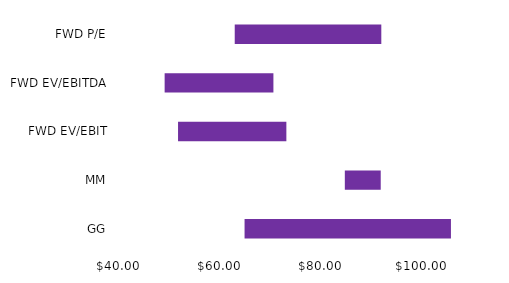
| Category | Q1 | Diff | Q3 |
|---|---|---|---|
| GG | 64.899 | 40.925 | 105.824 |
| MM | 84.781 | 7.12 | 91.901 |
| FWD EV/EBIT | 51.708 | 21.482 | 73.19 |
| FWD EV/EBITDA | 49.05 | 21.57 | 70.62 |
| FWD P/E | 62.95 | 29.066 | 92.016 |